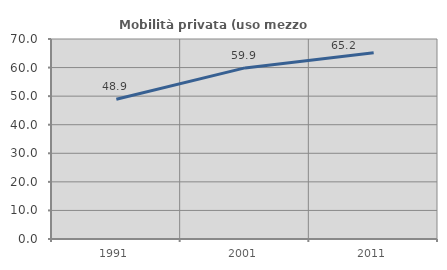
| Category | Mobilità privata (uso mezzo privato) |
|---|---|
| 1991.0 | 48.928 |
| 2001.0 | 59.879 |
| 2011.0 | 65.161 |